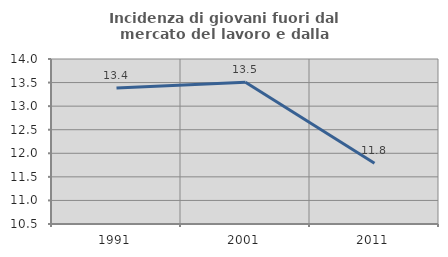
| Category | Incidenza di giovani fuori dal mercato del lavoro e dalla formazione  |
|---|---|
| 1991.0 | 13.382 |
| 2001.0 | 13.505 |
| 2011.0 | 11.788 |